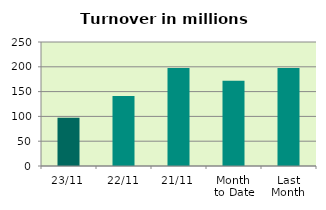
| Category | Series 0 |
|---|---|
| 23/11 | 97.066 |
| 22/11 | 141.315 |
| 21/11 | 197.333 |
| Month 
to Date | 171.821 |
| Last
Month | 197.652 |